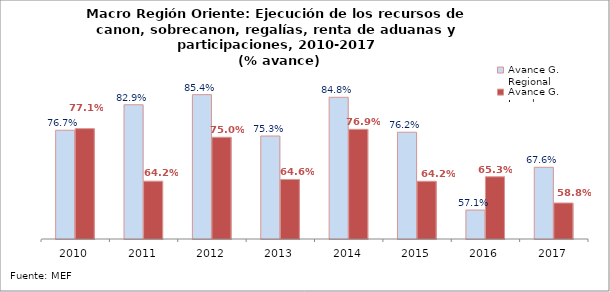
| Category | Avance G. Regional | Avance G. Locales |
|---|---|---|
| 2010 | 0.767 | 0.771 |
| 2011 | 0.829 | 0.642 |
| 2012 | 0.854 | 0.75 |
| 2013 | 0.753 | 0.646 |
| 2014 | 0.848 | 0.769 |
| 2015 | 0.762 | 0.642 |
| 2016 | 0.571 | 0.653 |
| 2017 | 0.676 | 0.588 |